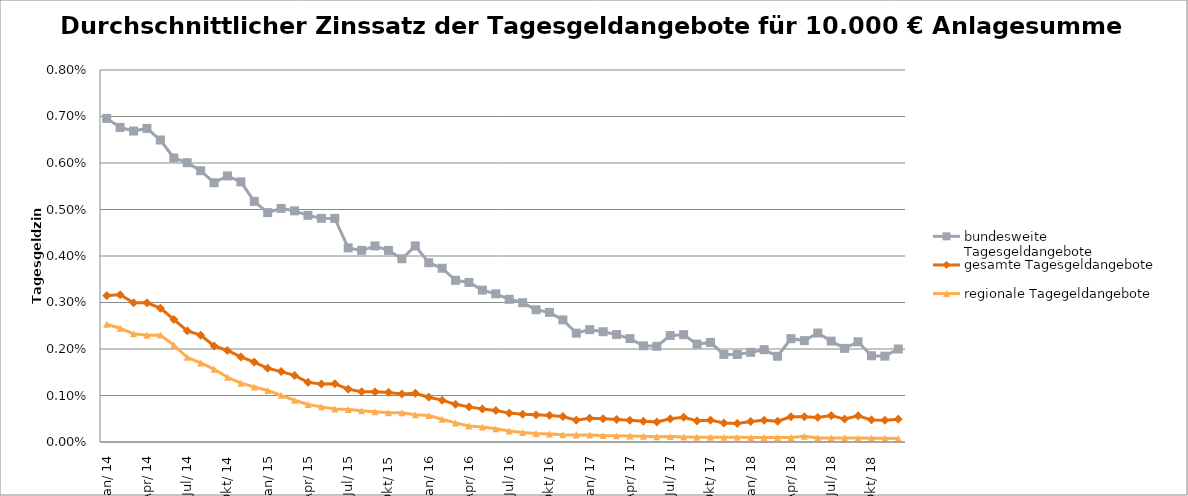
| Category | bundesweite Tagesgeldangebote | gesamte Tagesgeldangebote | regionale Tagegeldangebote |
|---|---|---|---|
| 2014-01-01 | 0.007 | 0.003 | 0.003 |
| 2014-02-01 | 0.007 | 0.003 | 0.002 |
| 2014-03-01 | 0.007 | 0.003 | 0.002 |
| 2014-04-01 | 0.007 | 0.003 | 0.002 |
| 2014-05-01 | 0.006 | 0.003 | 0.002 |
| 2014-06-01 | 0.006 | 0.003 | 0.002 |
| 2014-07-01 | 0.006 | 0.002 | 0.002 |
| 2014-08-01 | 0.006 | 0.002 | 0.002 |
| 2014-09-01 | 0.006 | 0.002 | 0.002 |
| 2014-10-01 | 0.006 | 0.002 | 0.001 |
| 2014-11-01 | 0.006 | 0.002 | 0.001 |
| 2014-12-01 | 0.005 | 0.002 | 0.001 |
| 2015-01-01 | 0.005 | 0.002 | 0.001 |
| 2015-02-01 | 0.005 | 0.002 | 0.001 |
| 2015-03-01 | 0.005 | 0.001 | 0.001 |
| 2015-04-01 | 0.005 | 0.001 | 0.001 |
| 2015-05-01 | 0.005 | 0.001 | 0.001 |
| 2015-06-01 | 0.005 | 0.001 | 0.001 |
| 2015-07-01 | 0.004 | 0.001 | 0.001 |
| 2015-08-01 | 0.004 | 0.001 | 0.001 |
| 2015-09-01 | 0.004 | 0.001 | 0.001 |
| 2015-10-01 | 0.004 | 0.001 | 0.001 |
| 2015-11-01 | 0.004 | 0.001 | 0.001 |
| 2015-12-01 | 0.004 | 0.001 | 0.001 |
| 2016-01-01 | 0.004 | 0.001 | 0.001 |
| 2016-02-01 | 0.004 | 0.001 | 0 |
| 2016-03-01 | 0.003 | 0.001 | 0 |
| 2016-04-01 | 0.003 | 0.001 | 0 |
| 2016-05-01 | 0.003 | 0.001 | 0 |
| 2016-06-01 | 0.003 | 0.001 | 0 |
| 2016-07-01 | 0.003 | 0.001 | 0 |
| 2016-08-01 | 0.003 | 0.001 | 0 |
| 2016-09-01 | 0.003 | 0.001 | 0 |
| 2016-10-01 | 0.003 | 0.001 | 0 |
| 2016-11-01 | 0.003 | 0.001 | 0 |
| 2016-12-01 | 0.002 | 0 | 0 |
| 2017-01-01 | 0.002 | 0.001 | 0 |
| 2017-02-01 | 0.002 | 0 | 0 |
| 2017-03-01 | 0.002 | 0 | 0 |
| 2017-04-01 | 0.002 | 0 | 0 |
| 2017-05-01 | 0.002 | 0 | 0 |
| 2017-06-01 | 0.002 | 0 | 0 |
| 2017-07-01 | 0.002 | 0 | 0 |
| 2017-08-01 | 0.002 | 0.001 | 0 |
| 2017-09-01 | 0.002 | 0 | 0 |
| 2017-10-01 | 0.002 | 0 | 0 |
| 2017-11-01 | 0.002 | 0 | 0 |
| 2017-12-01 | 0.002 | 0 | 0 |
| 2018-01-01 | 0.002 | 0 | 0 |
| 2018-02-01 | 0.002 | 0 | 0 |
| 2018-03-01 | 0.002 | 0 | 0 |
| 2018-04-01 | 0.002 | 0.001 | 0 |
| 2018-05-01 | 0.002 | 0.001 | 0 |
| 2018-06-01 | 0.002 | 0.001 | 0 |
| 2018-07-01 | 0.002 | 0.001 | 0 |
| 2018-08-01 | 0.002 | 0 | 0 |
| 2018-09-01 | 0.002 | 0.001 | 0 |
| 2018-10-01 | 0.002 | 0 | 0 |
| 2018-11-01 | 0.002 | 0 | 0 |
| 2018-12-01 | 0.002 | 0 | 0 |